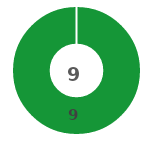
| Category | Series 0 |
|---|---|
| 0 | 9 |
| 1 | 0 |
| 2 | 0 |
| 3 | 0 |
| 4 | 0 |